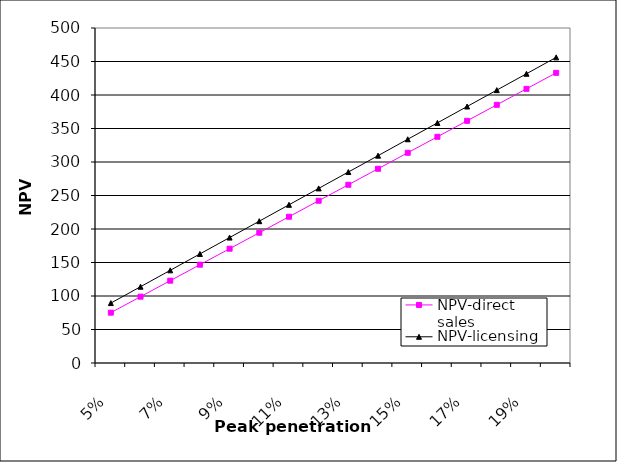
| Category | NPV-direct sales | NPV-licensing |
|---|---|---|
| 0.05 | 75.136 | 89.416 |
| 0.06 | 98.999 | 113.866 |
| 0.07 | 122.861 | 138.316 |
| 0.08 | 146.724 | 162.765 |
| 0.09 | 170.586 | 187.215 |
| 0.1 | 194.449 | 211.665 |
| 0.11 | 218.311 | 236.115 |
| 0.12 | 242.173 | 260.565 |
| 0.13 | 266.036 | 285.015 |
| 0.14 | 289.898 | 309.465 |
| 0.15 | 313.761 | 333.915 |
| 0.16 | 337.623 | 358.365 |
| 0.17 | 361.486 | 382.815 |
| 0.18 | 385.348 | 407.264 |
| 0.19 | 409.211 | 431.714 |
| 0.2 | 433.073 | 456.164 |